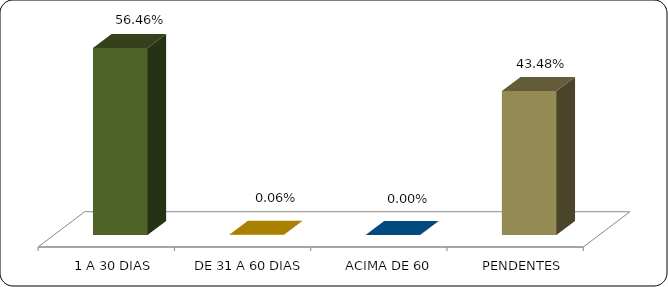
| Category | Series 0 |
|---|---|
|      1 A 30 DIAS | 0.565 |
|      DE 31 A 60 DIAS | 0.001 |
|      ACIMA DE 60 DIAS | 0 |
|      PENDENTES | 0.435 |